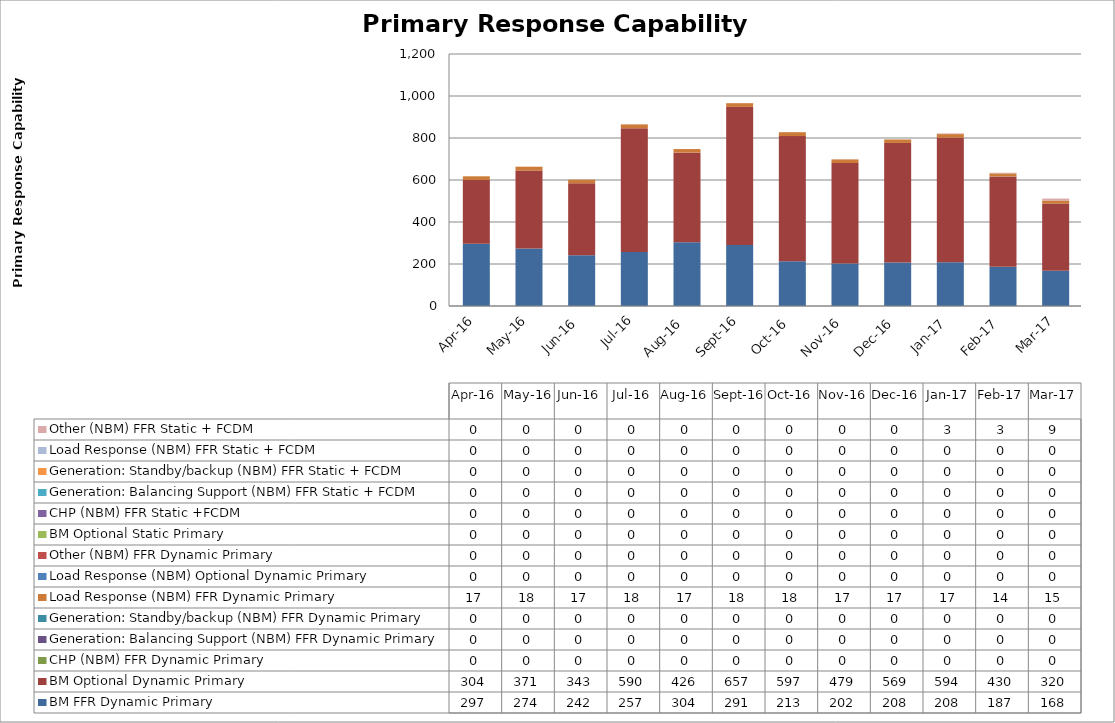
| Category | BM FFR Dynamic Primary | BM Optional Dynamic Primary | CHP (NBM) FFR Dynamic Primary | Generation: Balancing Support (NBM) FFR Dynamic Primary | Generation: Standby/backup (NBM) FFR Dynamic Primary | Load Response (NBM) FFR Dynamic Primary | Load Response (NBM) Optional Dynamic Primary | Other (NBM) FFR Dynamic Primary | BM Optional Static Primary | CHP (NBM) FFR Static +FCDM | Generation: Balancing Support (NBM) FFR Static + FCDM | Generation: Standby/backup (NBM) FFR Static + FCDM | Load Response (NBM) FFR Static + FCDM | Other (NBM) FFR Static + FCDM |
|---|---|---|---|---|---|---|---|---|---|---|---|---|---|---|
| 2016-04-01 | 296.651 | 303.676 | 0 | 0 | 0 | 17.226 | 0 | 0 | 0 | 0 | 0 | 0 | 0 | 0 |
| 2016-05-01 | 273.918 | 371.01 | 0 | 0 | 0 | 18.414 | 0 | 0 | 0 | 0 | 0 | 0 | 0 | 0 |
| 2016-06-01 | 241.576 | 342.706 | 0 | 0 | 0 | 17.226 | 0 | 0 | 0 | 0 | 0 | 0 | 0 | 0 |
| 2016-07-01 | 256.782 | 589.565 | 0 | 0 | 0 | 18.414 | 0 | 0 | 0 | 0 | 0 | 0 | 0 | 0 |
| 2016-08-01 | 303.68 | 426.389 | 0 | 0 | 0 | 17.226 | 0 | 0 | 0 | 0 | 0 | 0 | 0 | 0 |
| 2016-09-01 | 290.887 | 657.091 | 0 | 0 | 0 | 17.82 | 0 | 0 | 0 | 0 | 0 | 0 | 0 | 0 |
| 2016-10-01 | 212.604 | 596.627 | 0 | 0 | 0 | 18.439 | 0 | 0 | 0 | 0 | 0 | 0 | 0 | 0 |
| 2016-11-01 | 202.1 | 478.814 | 0 | 0 | 0 | 17.226 | 0 | 0 | 0 | 0 | 0 | 0 | 0 | 0 |
| 2016-12-01 | 207.655 | 568.76 | 0 | 0 | 0 | 16.632 | 0 | 0 | 0 | 0 | 0 | 0 | 0 | 0 |
| 2017-01-01 | 207.888 | 594.114 | 0 | 0 | 0 | 16.632 | 0 | 0 | 0 | 0 | 0 | 0 | 0 | 3.384 |
| 2017-02-01 | 187.264 | 429.886 | 0 | 0 | 0 | 14.256 | 0 | 0 | 0 | 0 | 0 | 0 | 0 | 3.162 |
| 2017-03-01 | 168.028 | 319.563 | 0 | 0 | 0 | 14.825 | 0 | 0 | 0 | 0 | 0 | 0 | 0 | 9.158 |